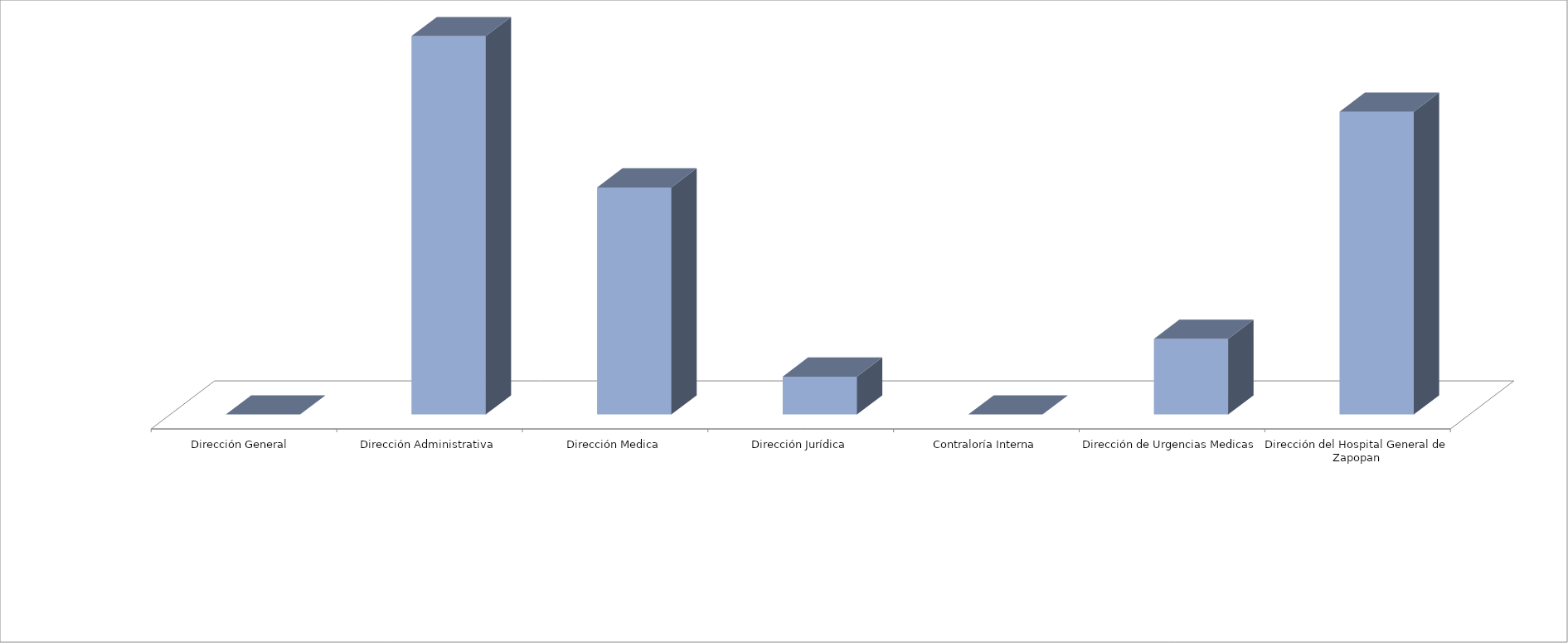
| Category | Series 0 | Series 1 |
|---|---|---|
| Dirección General  |  | 0 |
| Dirección Administrativa |  | 10 |
| Dirección Medica |  | 6 |
| Dirección Jurídica |  | 1 |
| Contraloría Interna |  | 0 |
| Dirección de Urgencias Medicas |  | 2 |
| Dirección del Hospital General de Zapopan |  | 8 |